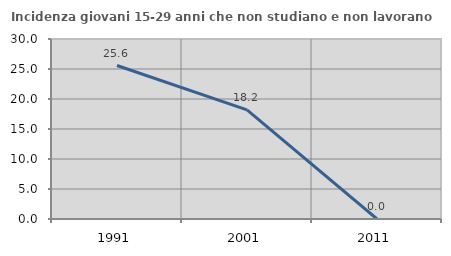
| Category | Incidenza giovani 15-29 anni che non studiano e non lavorano  |
|---|---|
| 1991.0 | 25.577 |
| 2001.0 | 18.182 |
| 2011.0 | 0 |